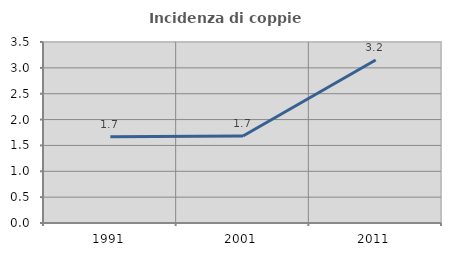
| Category | Incidenza di coppie miste |
|---|---|
| 1991.0 | 1.667 |
| 2001.0 | 1.683 |
| 2011.0 | 3.153 |